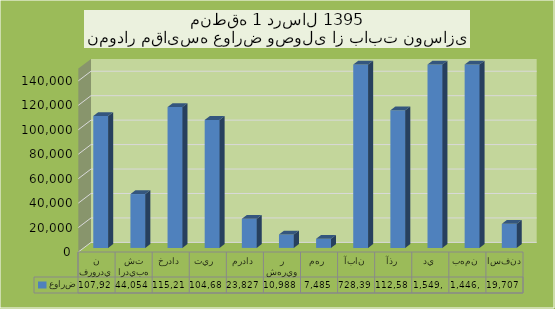
| Category | عوارض |
|---|---|
| فروردين | 107927 |
| ارديبهشت | 44054 |
| خرداد | 115211 |
| تير  | 104681 |
| مرداد | 23827 |
| شهريور | 10988 |
| مهر | 7485 |
| آبان | 728394 |
| آذر | 112584 |
| دي | 1549028 |
| بهمن | 1446939 |
| اسفند | 19707 |